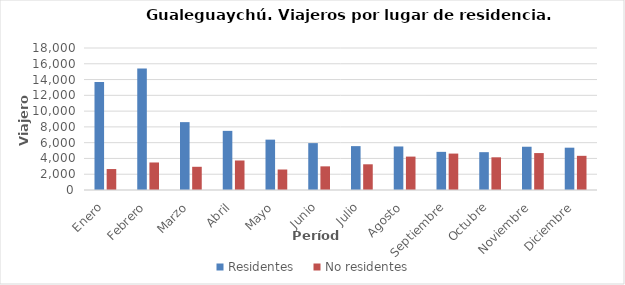
| Category | Residentes | No residentes |
|---|---|---|
| Enero | 13676 | 2656 |
| Febrero | 15414 | 3489 |
| Marzo | 8603 | 2942 |
| Abril | 7496 | 3741 |
| Mayo | 6383 | 2597 |
| Junio | 5943 | 2998 |
| Julio | 5562 | 3258 |
| Agosto | 5518 | 4234 |
| Septiembre | 4835 | 4617 |
| Octubre | 4796 | 4144 |
| Noviembre | 5484 | 4681 |
| Diciembre | 5364 | 4332 |